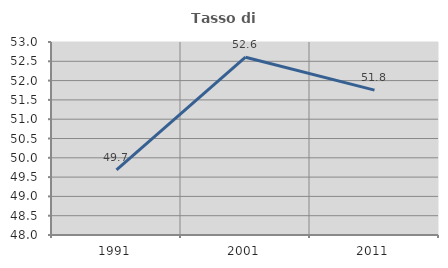
| Category | Tasso di occupazione   |
|---|---|
| 1991.0 | 49.688 |
| 2001.0 | 52.605 |
| 2011.0 | 51.754 |